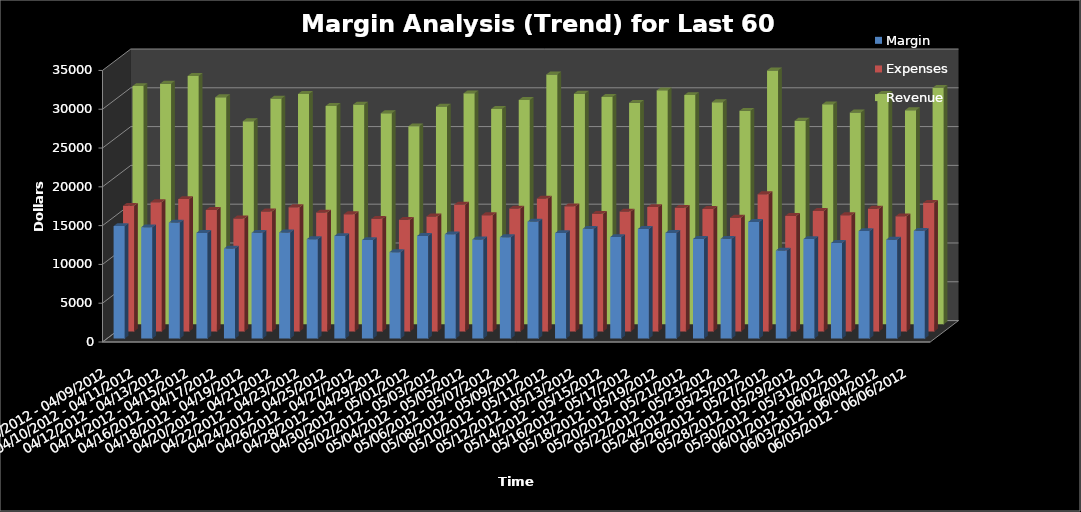
| Category | Margin | Expenses | Revenue |
|---|---|---|---|
| 04/08/2012 - 04/09/2012 | 14496 | 16198 | 30694 |
| 04/10/2012 - 04/11/2012 | 14347 | 16661 | 31008 |
| 04/12/2012 - 04/13/2012 | 14947 | 17056 | 32003 |
| 04/14/2012 - 04/15/2012 | 13616 | 15653 | 29269 |
| 04/16/2012 - 04/17/2012 | 11606 | 14568 | 26174 |
| 04/18/2012 - 04/19/2012 | 13622 | 15463 | 29085 |
| 04/20/2012 - 04/21/2012 | 13673 | 16018 | 29691 |
| 04/22/2012 - 04/23/2012 | 12813 | 15327 | 28140 |
| 04/24/2012 - 04/25/2012 | 13214 | 15109 | 28323 |
| 04/26/2012 - 04/27/2012 | 12695 | 14509 | 27204 |
| 04/28/2012 - 04/29/2012 | 11137 | 14379 | 25516 |
| 04/30/2012 - 05/01/2012 | 13233 | 14824 | 28057 |
| 05/02/2012 - 05/03/2012 | 13433 | 16332 | 29765 |
| 05/04/2012 - 05/05/2012 | 12774 | 14984 | 27758 |
| 05/06/2012 - 05/07/2012 | 13070 | 15838 | 28908 |
| 05/08/2012 - 05/09/2012 | 15073 | 17126 | 32199 |
| 05/10/2012 - 05/11/2012 | 13594 | 16129 | 29723 |
| 05/12/2012 - 05/13/2012 | 14144 | 15158 | 29302 |
| 05/14/2012 - 05/15/2012 | 13088 | 15457 | 28545 |
| 05/16/2012 - 05/17/2012 | 14127 | 16020 | 30147 |
| 05/18/2012 - 05/19/2012 | 13613 | 15932 | 29545 |
| 05/20/2012 - 05/21/2012 | 12841 | 15784 | 28625 |
| 05/22/2012 - 05/23/2012 | 12861 | 14655 | 27516 |
| 05/24/2012 - 05/25/2012 | 15027 | 17689 | 32716 |
| 05/26/2012 - 05/27/2012 | 11347 | 14891 | 26238 |
| 05/28/2012 - 05/29/2012 | 12817 | 15527 | 28344 |
| 05/30/2012 - 05/31/2012 | 12320 | 14977 | 27297 |
| 06/01/2012 - 06/02/2012 | 13861 | 15825 | 29686 |
| 06/03/2012 - 06/04/2012 | 12746 | 14843 | 27589 |
| 06/05/2012 - 06/06/2012 | 13895 | 16579 | 30474 |